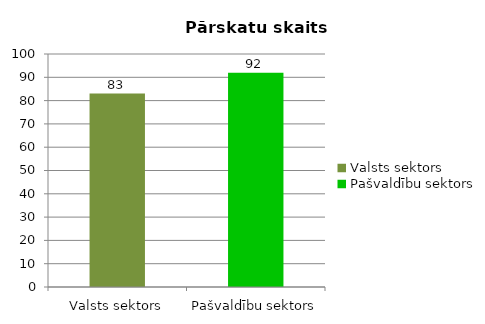
| Category |  Pārskatu skaits |
|---|---|
| Valsts sektors | 83 |
| Pašvaldību sektors | 92 |